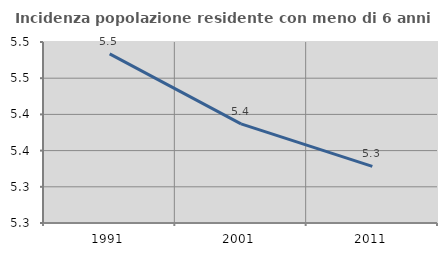
| Category | Incidenza popolazione residente con meno di 6 anni |
|---|---|
| 1991.0 | 5.484 |
| 2001.0 | 5.387 |
| 2011.0 | 5.328 |